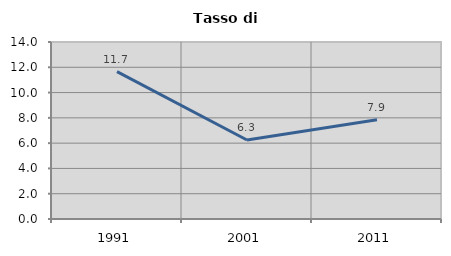
| Category | Tasso di disoccupazione   |
|---|---|
| 1991.0 | 11.663 |
| 2001.0 | 6.25 |
| 2011.0 | 7.851 |